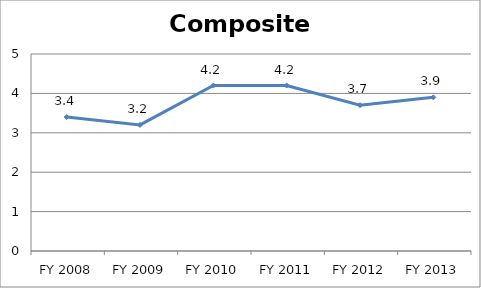
| Category | Composite score |
|---|---|
| FY 2013 | 3.9 |
| FY 2012 | 3.7 |
| FY 2011 | 4.2 |
| FY 2010 | 4.2 |
| FY 2009 | 3.2 |
| FY 2008 | 3.4 |